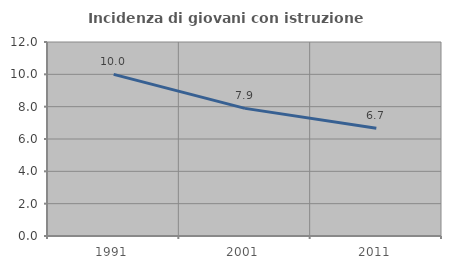
| Category | Incidenza di giovani con istruzione universitaria |
|---|---|
| 1991.0 | 10 |
| 2001.0 | 7.895 |
| 2011.0 | 6.667 |